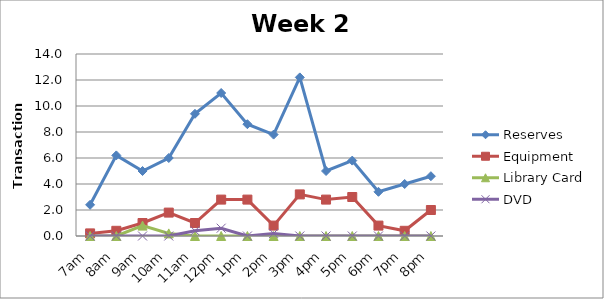
| Category | Reserves | Equipment | Library Card | DVD |
|---|---|---|---|---|
| 7am | 2.4 | 0.2 | 0 | 0 |
| 8am | 6.2 | 0.4 | 0 | 0 |
| 9am | 5 | 1 | 0.8 | 0 |
| 10am | 6 | 1.8 | 0.2 | 0 |
| 11am | 9.4 | 1 | 0 | 0.4 |
| 12pm | 11 | 2.8 | 0 | 0.6 |
| 1pm | 8.6 | 2.8 | 0 | 0 |
| 2pm | 7.8 | 0.8 | 0 | 0.2 |
| 3pm | 12.2 | 3.2 | 0 | 0 |
| 4pm | 5 | 2.8 | 0 | 0 |
| 5pm | 5.8 | 3 | 0 | 0 |
| 6pm | 3.4 | 0.8 | 0 | 0 |
| 7pm | 4 | 0.4 | 0 | 0 |
| 8pm | 4.6 | 2 | 0 | 0 |